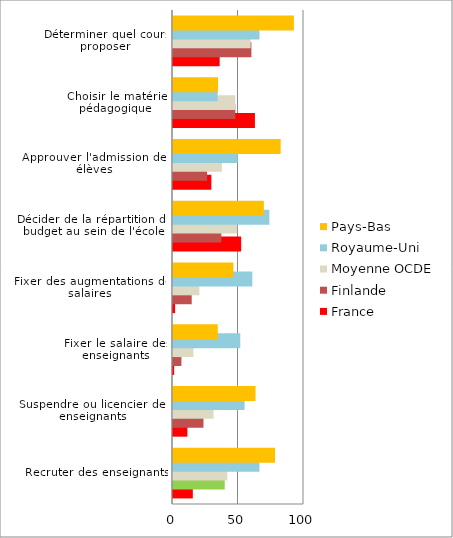
| Category | France | Finlande | Moyenne OCDE | Royaume-Uni | Pays-Bas |
|---|---|---|---|---|---|
| Recruter des enseignants | 15.136 | 39.48 | 41.457 | 65.992 | 77.901 |
| Suspendre ou licencier des enseignants | 10.982 | 23.26 | 30.963 | 54.634 | 63.005 |
| Fixer le salaire des enseignants | 0.884 | 6.434 | 15.592 | 51.353 | 34.202 |
| Fixer des augmentations de salaires | 1.604 | 14.283 | 20.112 | 60.57 | 46.064 |
| Décider de la répartition du budget au sein de l'école | 52.054 | 36.905 | 48.982 | 73.567 | 69.342 |
| Approuver l'admission des élèves | 29.262 | 26.017 | 37.331 | 49.415 | 82.17 |
| Choisir le matériel pédagogique  | 62.53 | 47.568 | 47.514 | 34.057 | 34.371 |
| Déterminer quel cours proposer | 35.624 | 59.854 | 59.274 | 66.013 | 92.298 |